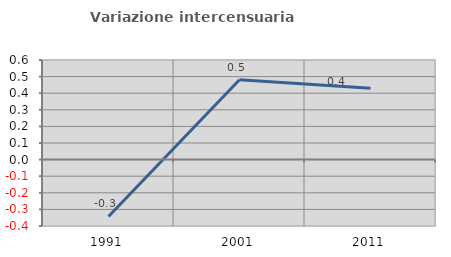
| Category | Variazione intercensuaria annua |
|---|---|
| 1991.0 | -0.343 |
| 2001.0 | 0.481 |
| 2011.0 | 0.43 |